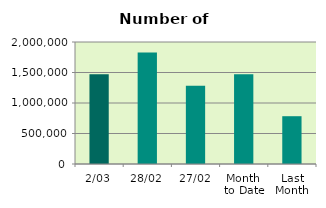
| Category | Series 0 |
|---|---|
| 2/03 | 1471698 |
| 28/02 | 1827192 |
| 27/02 | 1284770 |
| Month 
to Date | 1471698 |
| Last
Month | 783511.9 |